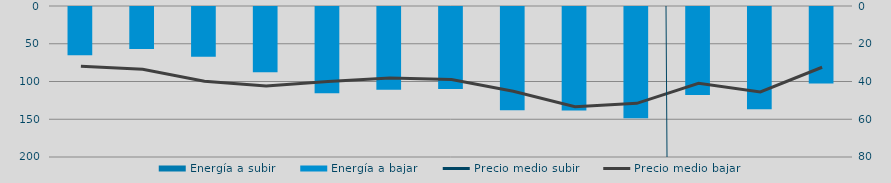
| Category | Energía a subir | Energía a bajar |
|---|---|---|
| D |  | 65080.662 |
| E |  | 56832.525 |
| F |  | 67245.511 |
| M |  | 87837.741 |
| A |  | 115472.265 |
| M |  | 110945.08 |
| J |  | 109933.033 |
| J |  | 138127.981 |
| A |  | 138345.883 |
| S |  | 148810.416 |
| O |  | 118042.065 |
| N |  | 136637.182 |
| D |  | 102576.868 |